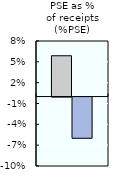
| Category | 2000-02 | 2016-18 |
|---|---|---|
| PSE as %
of receipts (%PSE) | 0.059 | -0.059 |